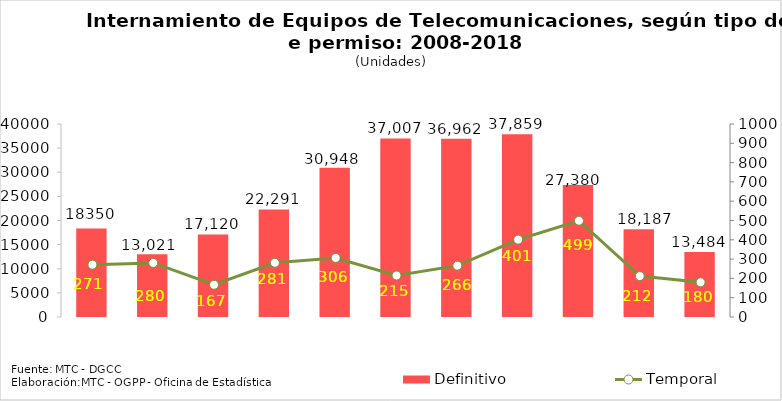
| Category | Definitivo |
|---|---|
| 2008.0 | 18350 |
| 2009.0 | 13021 |
| 2010.0 | 17120 |
| 2011.0 | 22291 |
| 2012.0 | 30948 |
| 2013.0 | 37007 |
| 2014.0 | 36962 |
| 2015.0 | 37859 |
| 2016.0 | 27380 |
| 2017.0 | 18187 |
| 2018.0 | 13484 |